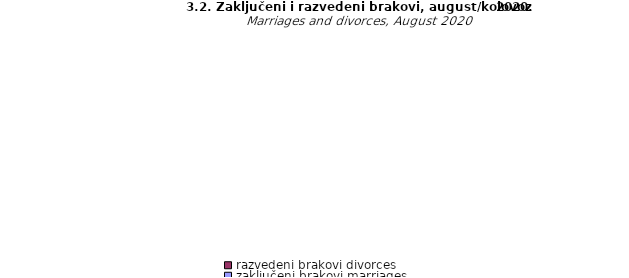
| Category | zaključeni brakovi marriages | razvedeni brakovi divorces |
|---|---|---|
| Unsko - sanski | 225 | 38 |
| Kanton Posavski | 16 | 1 |
| Tuzlanski | 380 | 30 |
| Zeničko - dobojski | 348 | 15 |
| Bosansko - podrinjski | 28 | 1 |
| Srednjobosanski | 206 | 10 |
| Hercegovačko-
neretvanski | 156 | 10 |
| Zapadnohercegovački | 50 | 1 |
| Kanton Sarajevo | 362 | 12 |
| Kanton 10 | 38 | 2 |